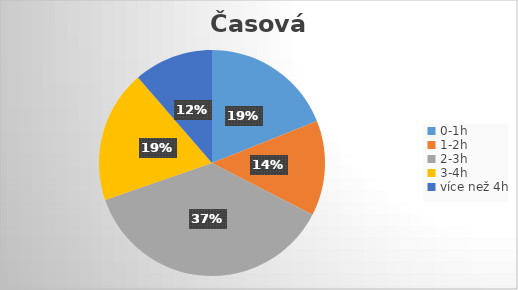
| Category | Series 0 |
|---|---|
| 0-1h | 25 |
| 1-2h | 18 |
| 2-3h | 49 |
| 3-4h | 25 |
| více než 4h | 15 |